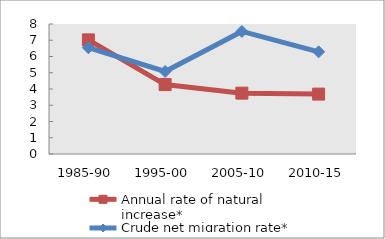
| Category | Annual rate of natural increase* | Crude net migration rate* |
|---|---|---|
| 1985-90 | 7.023 | 6.542 |
| 1995-00 | 4.273 | 5.078 |
| 2005-10 | 3.746 | 7.542 |
| 2010-15 | 3.686 | 6.286 |